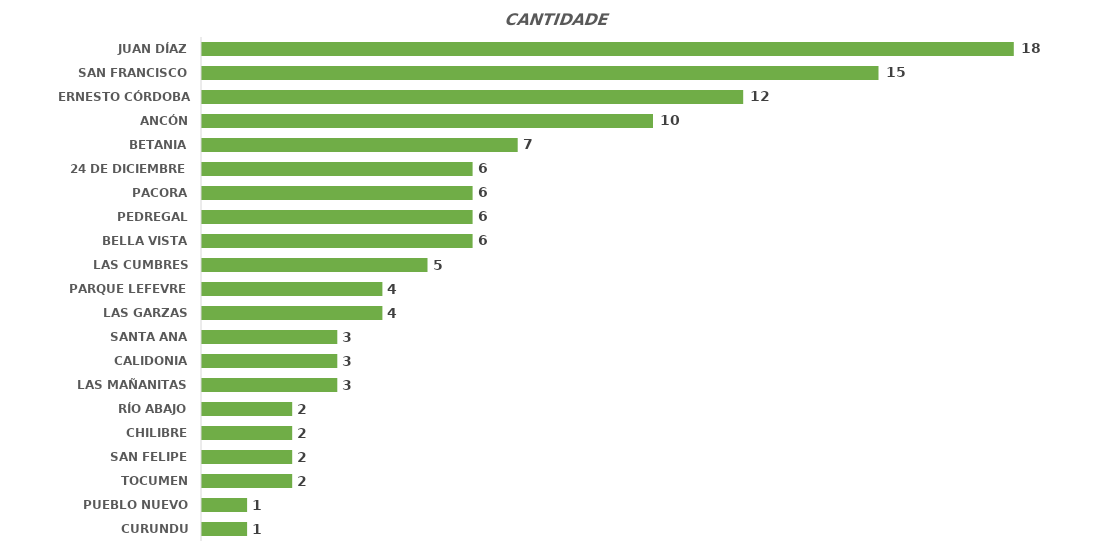
| Category | Total |
|---|---|
| CURUNDU | 1 |
| PUEBLO NUEVO | 1 |
| TOCUMEN | 2 |
| SAN FELIPE | 2 |
| CHILIBRE | 2 |
| RÍO ABAJO | 2 |
| LAS MAÑANITAS | 3 |
| CALIDONIA | 3 |
| SANTA ANA | 3 |
| LAS GARZAS | 4 |
| PARQUE LEFEVRE | 4 |
| LAS CUMBRES | 5 |
| BELLA VISTA | 6 |
| PEDREGAL | 6 |
| PACORA | 6 |
| 24 DE DICIEMBRE | 6 |
| BETANIA | 7 |
| ANCÓN | 10 |
| ERNESTO CÓRDOBA CAMPOS | 12 |
| SAN FRANCISCO | 15 |
| JUAN DÍAZ | 18 |